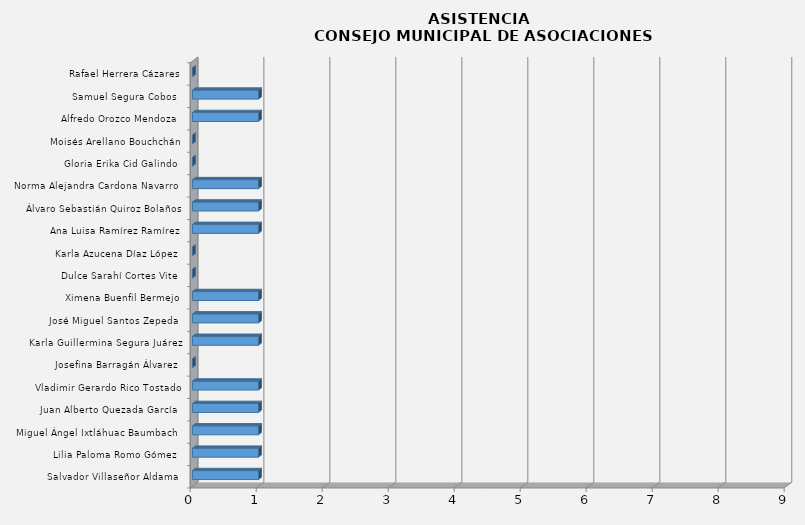
| Category | Series 0 |
|---|---|
| Salvador Villaseñor Aldama  | 1 |
| Lilia Paloma Romo Gómez  | 1 |
| Miguel Ángel Ixtláhuac Baumbach  | 1 |
| Juan Alberto Quezada García  | 1 |
| Vladimir Gerardo Rico Tostado | 1 |
| Josefina Barragán Álvarez  | 0 |
| Karla Guillermina Segura Juárez | 1 |
| José Miguel Santos Zepeda  | 1 |
| Ximena Buenfil Bermejo | 1 |
| Dulce Sarahí Cortes Vite  | 0 |
| Karla Azucena Díaz López  | 0 |
| Ana Luisa Ramírez Ramírez | 1 |
| Álvaro Sebastián Quiroz Bolaños | 1 |
| Norma Alejandra Cardona Navarro  | 1 |
| Gloria Erika Cid Galindo  | 0 |
| Moisés Arellano Bouchchán | 0 |
| Alfredo Orozco Mendoza  | 1 |
| Samuel Segura Cobos  | 1 |
| Rafael Herrera Cázares | 0 |